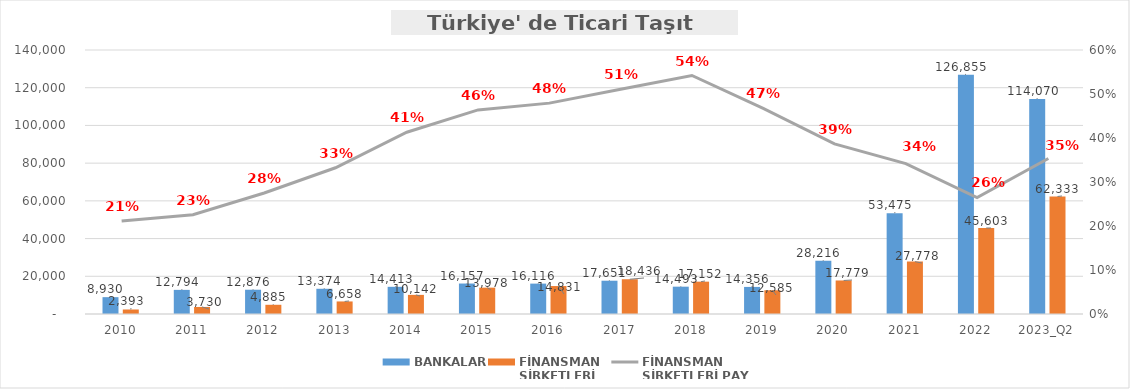
| Category | BANKALAR | FİNANSMAN 
ŞİRKETLERİ |
|---|---|---|
| 2010 | 8930.131 | 2392.721 |
| 2011 | 12793.723 | 3729.987 |
| 2012 | 12876.346 | 4885.495 |
| 2013 | 13374.424 | 6657.806 |
| 2014 | 14412.767 | 10141.887 |
| 2015 | 16157.225 | 13978.426 |
| 2016 | 16116.463 | 14831.249 |
| 2017 | 17650.963 | 18436.034 |
| 2018 | 14492.83 | 17152.034 |
| 2019 | 14355.978 | 12584.792 |
| 2020 | 28216.157 | 17779.072 |
| 2021 | 53475.488 | 27778.353 |
| 2022 | 126855.404 | 45602.871 |
| 2023_Q2 | 114069.764 | 62333.318 |